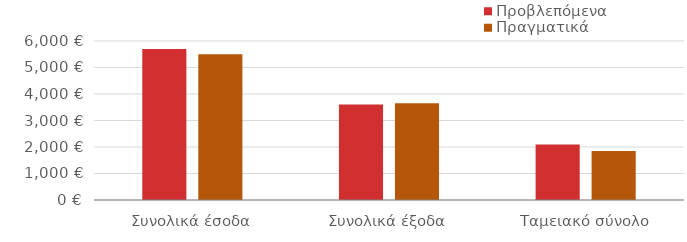
| Category | Προβλεπόμενα | Πραγματικά |
|---|---|---|
| Συνολικά έσοδα | 5700 | 5500 |
| Συνολικά έξοδα | 3603 | 3655 |
| Ταμειακό σύνολο | 2097 | 1845 |